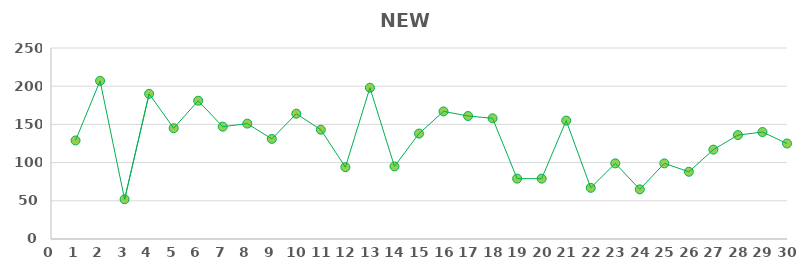
| Category | NEW VISITORS |
|---|---|
| 1.0 | 129 |
| 2.0 | 207 |
| 3.0 | 52 |
| 4.0 | 190 |
| 5.0 | 145 |
| 6.0 | 181 |
| 7.0 | 147 |
| 8.0 | 151 |
| 9.0 | 131 |
| 10.0 | 164 |
| 11.0 | 143 |
| 12.0 | 94 |
| 13.0 | 198 |
| 14.0 | 95 |
| 15.0 | 138 |
| 16.0 | 167 |
| 17.0 | 161 |
| 18.0 | 158 |
| 19.0 | 79 |
| 20.0 | 79 |
| 21.0 | 155 |
| 22.0 | 67 |
| 23.0 | 99 |
| 24.0 | 65 |
| 25.0 | 99 |
| 26.0 | 88 |
| 27.0 | 117 |
| 28.0 | 136 |
| 29.0 | 140 |
| 30.0 | 125 |